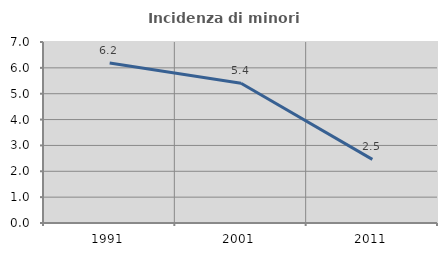
| Category | Incidenza di minori stranieri |
|---|---|
| 1991.0 | 6.186 |
| 2001.0 | 5.405 |
| 2011.0 | 2.459 |